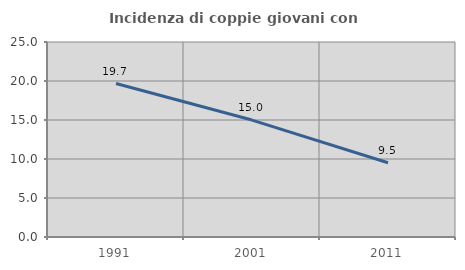
| Category | Incidenza di coppie giovani con figli |
|---|---|
| 1991.0 | 19.674 |
| 2001.0 | 14.992 |
| 2011.0 | 9.519 |